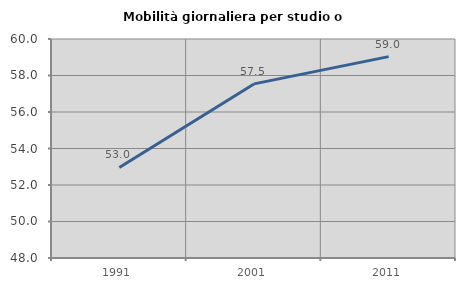
| Category | Mobilità giornaliera per studio o lavoro |
|---|---|
| 1991.0 | 52.963 |
| 2001.0 | 57.54 |
| 2011.0 | 59.035 |